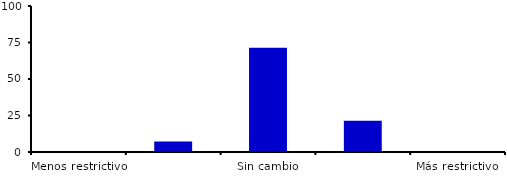
| Category | Series 0 |
|---|---|
| Menos restrictivo | 0 |
| Moderadamente menos restrictivo | 7.143 |
| Sin cambio | 71.429 |
| Moderadamente más restrictivo | 21.429 |
| Más restrictivo | 0 |